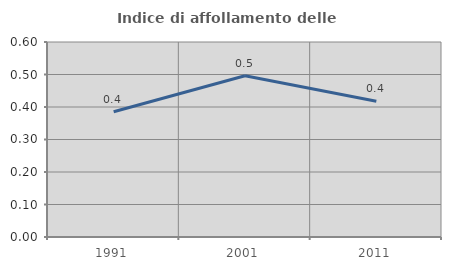
| Category | Indice di affollamento delle abitazioni  |
|---|---|
| 1991.0 | 0.385 |
| 2001.0 | 0.496 |
| 2011.0 | 0.418 |